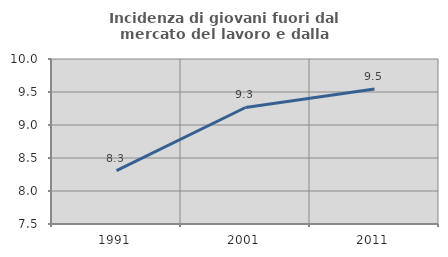
| Category | Incidenza di giovani fuori dal mercato del lavoro e dalla formazione  |
|---|---|
| 1991.0 | 8.309 |
| 2001.0 | 9.266 |
| 2011.0 | 9.545 |